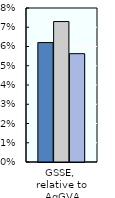
| Category | 1986-88 | 2000-02 | 2018-20 |
|---|---|---|---|
| GSSE, 
relative to AgGVA | 0.062 | 0.073 | 0.056 |